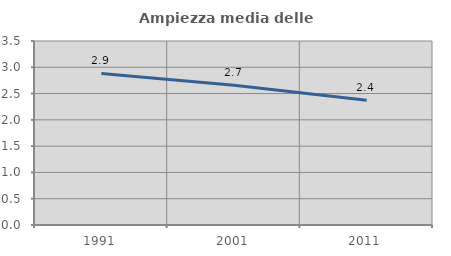
| Category | Ampiezza media delle famiglie |
|---|---|
| 1991.0 | 2.882 |
| 2001.0 | 2.66 |
| 2011.0 | 2.373 |